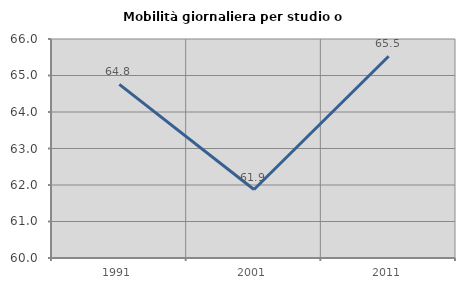
| Category | Mobilità giornaliera per studio o lavoro |
|---|---|
| 1991.0 | 64.758 |
| 2001.0 | 61.876 |
| 2011.0 | 65.528 |